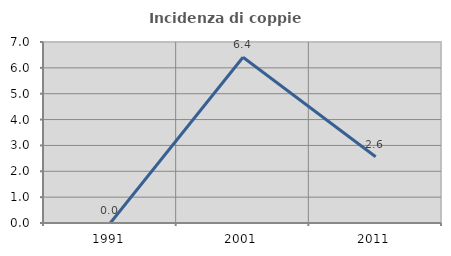
| Category | Incidenza di coppie miste |
|---|---|
| 1991.0 | 0 |
| 2001.0 | 6.41 |
| 2011.0 | 2.564 |